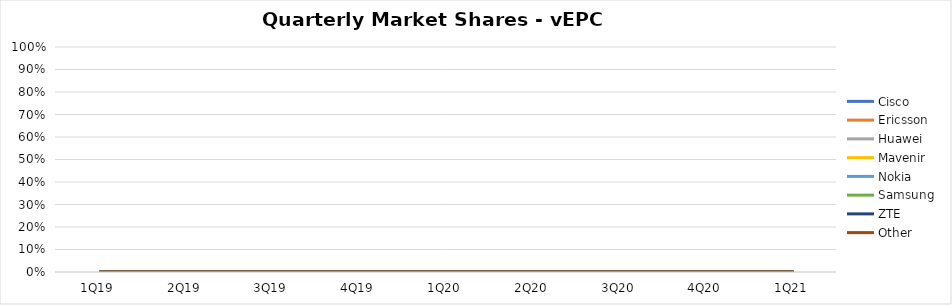
| Category | Cisco | Ericsson | Huawei | Mavenir | Nokia | Samsung | ZTE | Other |
|---|---|---|---|---|---|---|---|---|
| 1Q19 | 0 | 0 | 0 | 0 | 0 | 0 | 0 | 0 |
| 2Q19 | 0 | 0 | 0 | 0 | 0 | 0 | 0 | 0 |
| 3Q19 | 0 | 0 | 0 | 0 | 0 | 0 | 0 | 0 |
| 4Q19 | 0 | 0 | 0 | 0 | 0 | 0 | 0 | 0 |
| 1Q20 | 0 | 0 | 0 | 0 | 0 | 0 | 0 | 0 |
| 2Q20 | 0 | 0 | 0 | 0 | 0 | 0 | 0 | 0 |
| 3Q20 | 0 | 0 | 0 | 0 | 0 | 0 | 0 | 0 |
| 4Q20 | 0 | 0 | 0 | 0 | 0 | 0 | 0 | 0 |
| 1Q21 | 0 | 0 | 0 | 0 | 0 | 0 | 0 | 0 |